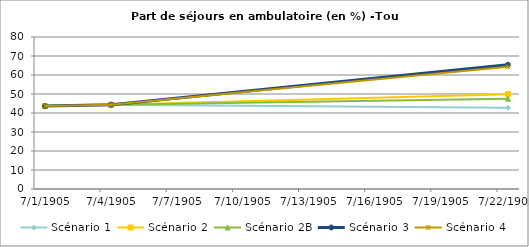
| Category | Scénario 1 | Scénario 2 | Scénario 2B | Scénario 3 | Scénario 4 |
|---|---|---|---|---|---|
| 2009.0 | 43.628 | 43.628 | 43.628 | 43.628 | 43.628 |
| 2012.0 | 44.367 | 44.367 | 44.367 | 44.367 | 44.367 |
| 2030.0 | 42.769 | 49.927 | 47.555 | 65.368 | 64.289 |